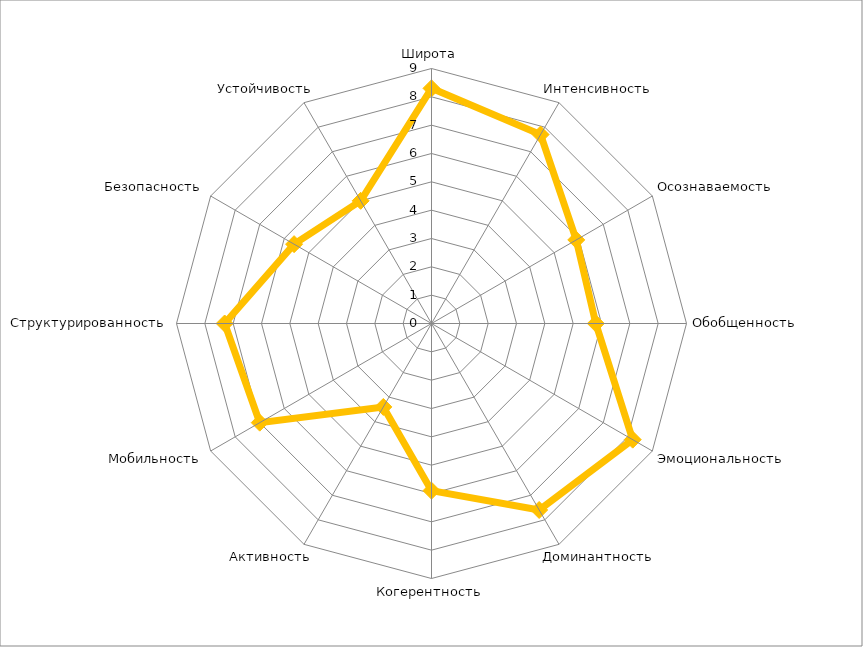
| Category | Series 0 |
|---|---|
| Широта | 8.3 |
| Интенсивность | 7.7 |
| Осознаваемость | 5.9 |
| Обобщенность | 5.8 |
| Эмоциональность | 8.2 |
| Доминантность | 7.6 |
| Когерентность | 5.9 |
| Активность | 3.4 |
| Мобильность | 7 |
| Структурированность | 7.3 |
| Безопасность | 5.6 |
| Устойчивость | 5 |